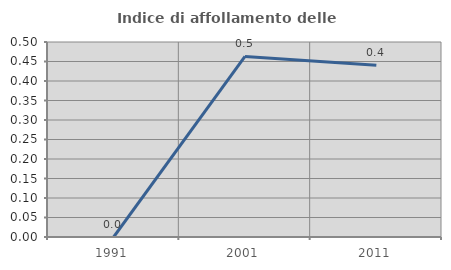
| Category | Indice di affollamento delle abitazioni  |
|---|---|
| 1991.0 | 0 |
| 2001.0 | 0.463 |
| 2011.0 | 0.441 |